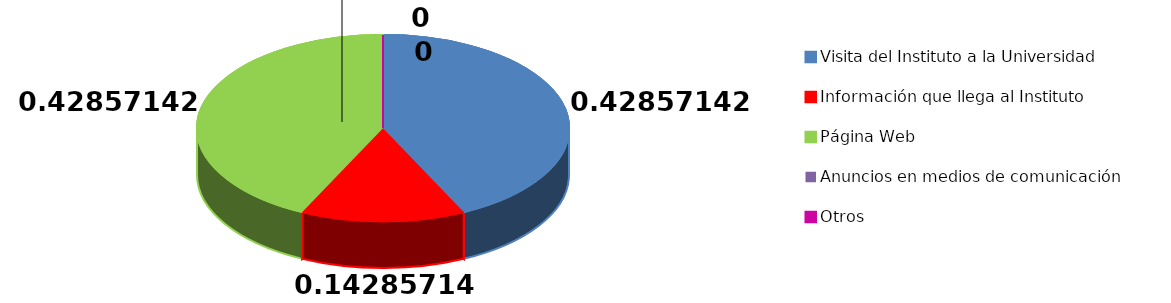
| Category | Series 0 |
|---|---|
| Visita del Instituto a la Universidad | 6 |
| Información que llega al Instituto | 2 |
| Página Web | 6 |
| Anuncios en medios de comunicación | 0 |
| Otros | 0 |